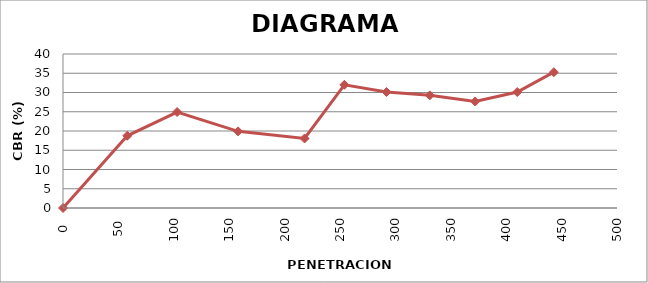
| Category | DIAGRAMA ESTRUCTURAL |
|---|---|
| 0.0 | 0 |
| 58.0 | 18.758 |
| 103.0 | 24.925 |
| 158.0 | 19.908 |
| 218.0 | 18.059 |
| 254.0 | 32.002 |
| 292.0 | 30.121 |
| 331.0 | 29.257 |
| 372.0 | 27.664 |
| 410.0 | 30.121 |
| 443.0 | 35.277 |